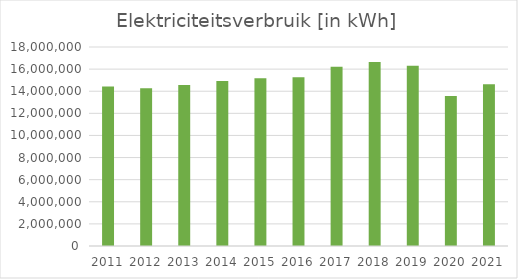
| Category | Elektriciteit |
|---|---|
| 2011.0 | 14433495 |
| 2012.0 | 14275264 |
| 2013.0 | 14565319 |
| 2014.0 | 14915895 |
| 2015.0 | 15164597 |
| 2016.0 | 15261931 |
| 2017.0 | 16207041 |
| 2018.0 | 16647600.3 |
| 2019.0 | 16296795 |
| 2020.0 | 13578150 |
| 2021.0 | 14638998 |